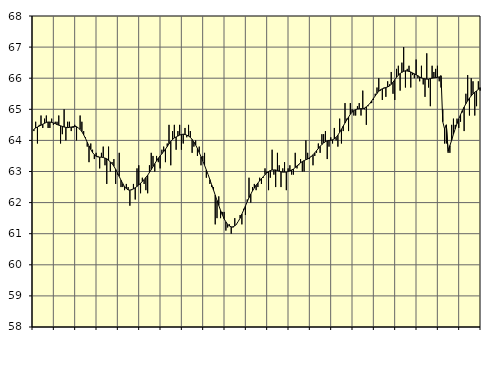
| Category | Piggar | Series 1 |
|---|---|---|
| nan | 64.3 | 64.36 |
| 1.0 | 64.6 | 64.4 |
| 1.0 | 63.9 | 64.43 |
| 1.0 | 64.5 | 64.46 |
| 1.0 | 64.8 | 64.49 |
| 1.0 | 64.4 | 64.52 |
| 1.0 | 64.7 | 64.55 |
| 1.0 | 64.8 | 64.58 |
| 1.0 | 64.4 | 64.59 |
| 1.0 | 64.4 | 64.59 |
| 1.0 | 64.7 | 64.58 |
| 1.0 | 64.5 | 64.56 |
| nan | 64.6 | 64.54 |
| 2.0 | 64.6 | 64.51 |
| 2.0 | 64.8 | 64.49 |
| 2.0 | 63.9 | 64.47 |
| 2.0 | 64.2 | 64.45 |
| 2.0 | 65 | 64.43 |
| 2.0 | 64 | 64.42 |
| 2.0 | 64.6 | 64.41 |
| 2.0 | 64.6 | 64.42 |
| 2.0 | 64.3 | 64.43 |
| 2.0 | 64.4 | 64.44 |
| 2.0 | 64.5 | 64.45 |
| nan | 64 | 64.44 |
| 3.0 | 64.4 | 64.4 |
| 3.0 | 64.8 | 64.35 |
| 3.0 | 64.6 | 64.28 |
| 3.0 | 64.3 | 64.18 |
| 3.0 | 64.1 | 64.07 |
| 3.0 | 63.8 | 63.94 |
| 3.0 | 63.3 | 63.82 |
| 3.0 | 63.9 | 63.71 |
| 3.0 | 63.7 | 63.61 |
| 3.0 | 63.4 | 63.54 |
| 3.0 | 63.6 | 63.49 |
| nan | 63.5 | 63.47 |
| 4.0 | 63.1 | 63.46 |
| 4.0 | 63.6 | 63.46 |
| 4.0 | 63.8 | 63.45 |
| 4.0 | 63.2 | 63.43 |
| 4.0 | 62.6 | 63.41 |
| 4.0 | 63.8 | 63.36 |
| 4.0 | 63 | 63.31 |
| 4.0 | 63.3 | 63.25 |
| 4.0 | 63.4 | 63.17 |
| 4.0 | 62.6 | 63.07 |
| 4.0 | 62.9 | 62.96 |
| nan | 63.6 | 62.84 |
| 5.0 | 62.5 | 62.72 |
| 5.0 | 62.5 | 62.61 |
| 5.0 | 62.4 | 62.51 |
| 5.0 | 62.6 | 62.45 |
| 5.0 | 62.5 | 62.41 |
| 5.0 | 61.9 | 62.4 |
| 5.0 | 62.4 | 62.42 |
| 5.0 | 62.6 | 62.44 |
| 5.0 | 62.1 | 62.48 |
| 5.0 | 63.1 | 62.52 |
| 5.0 | 63.2 | 62.57 |
| nan | 62.3 | 62.62 |
| 6.0 | 62.8 | 62.68 |
| 6.0 | 62.6 | 62.74 |
| 6.0 | 62.4 | 62.81 |
| 6.0 | 62.3 | 62.88 |
| 6.0 | 63.2 | 62.97 |
| 6.0 | 63.6 | 63.06 |
| 6.0 | 63.5 | 63.16 |
| 6.0 | 63 | 63.25 |
| 6.0 | 63.5 | 63.34 |
| 6.0 | 63.3 | 63.43 |
| 6.0 | 63.1 | 63.5 |
| nan | 63.7 | 63.57 |
| 7.0 | 63.8 | 63.64 |
| 7.0 | 63.3 | 63.72 |
| 7.0 | 63.9 | 63.8 |
| 7.0 | 64.5 | 63.89 |
| 7.0 | 63.2 | 63.97 |
| 7.0 | 64.3 | 64.03 |
| 7.0 | 64.5 | 64.08 |
| 7.0 | 63.7 | 64.11 |
| 7.0 | 64.3 | 64.14 |
| 7.0 | 64.5 | 64.17 |
| 7.0 | 63.7 | 64.19 |
| nan | 63.9 | 64.2 |
| 8.0 | 64.4 | 64.19 |
| 8.0 | 64.1 | 64.17 |
| 8.0 | 64.5 | 64.14 |
| 8.0 | 64.3 | 64.1 |
| 8.0 | 63.6 | 64.03 |
| 8.0 | 63.8 | 63.95 |
| 8.0 | 64 | 63.85 |
| 8.0 | 63.5 | 63.74 |
| 8.0 | 63.8 | 63.61 |
| 8.0 | 63.2 | 63.48 |
| 8.0 | 63.5 | 63.34 |
| nan | 63.6 | 63.2 |
| 9.0 | 62.8 | 63.05 |
| 9.0 | 62.9 | 62.9 |
| 9.0 | 62.6 | 62.74 |
| 9.0 | 62.5 | 62.57 |
| 9.0 | 62.5 | 62.41 |
| 9.0 | 61.3 | 62.24 |
| 9.0 | 61.5 | 62.07 |
| 9.0 | 62.2 | 61.91 |
| 9.0 | 61.5 | 61.75 |
| 9.0 | 61.7 | 61.61 |
| 9.0 | 61.7 | 61.48 |
| nan | 61.1 | 61.38 |
| 10.0 | 61.2 | 61.3 |
| 10.0 | 61.3 | 61.25 |
| 10.0 | 61 | 61.22 |
| 10.0 | 61.2 | 61.22 |
| 10.0 | 61.5 | 61.25 |
| 10.0 | 61.3 | 61.31 |
| 10.0 | 61.4 | 61.4 |
| 10.0 | 61.6 | 61.5 |
| 10.0 | 61.3 | 61.63 |
| 10.0 | 61.8 | 61.76 |
| 10.0 | 61.6 | 61.89 |
| nan | 62.1 | 62.03 |
| 11.0 | 62.8 | 62.16 |
| 11.0 | 62 | 62.27 |
| 11.0 | 62.5 | 62.38 |
| 11.0 | 62.6 | 62.47 |
| 11.0 | 62.4 | 62.56 |
| 11.0 | 62.5 | 62.63 |
| 11.0 | 62.8 | 62.7 |
| 11.0 | 62.6 | 62.77 |
| 11.0 | 62.8 | 62.83 |
| 11.0 | 63.1 | 62.9 |
| 11.0 | 63 | 62.95 |
| nan | 62.4 | 63 |
| 12.0 | 62.8 | 63.03 |
| 12.0 | 63.7 | 63.05 |
| 12.0 | 62.9 | 63.05 |
| 12.0 | 62.5 | 63.05 |
| 12.0 | 63.6 | 63.03 |
| 12.0 | 63.2 | 63.01 |
| 12.0 | 62.5 | 62.99 |
| 12.0 | 63.1 | 62.98 |
| 12.0 | 63.3 | 62.98 |
| 12.0 | 62.4 | 62.98 |
| 12.0 | 63.1 | 63 |
| nan | 63.2 | 63.02 |
| 13.0 | 62.9 | 63.05 |
| 13.0 | 62.9 | 63.08 |
| 13.0 | 63.6 | 63.13 |
| 13.0 | 63.1 | 63.18 |
| 13.0 | 63.2 | 63.23 |
| 13.0 | 63.4 | 63.28 |
| 13.0 | 63 | 63.32 |
| 13.0 | 63 | 63.35 |
| 13.0 | 64 | 63.38 |
| 13.0 | 63.6 | 63.4 |
| 13.0 | 63.4 | 63.44 |
| nan | 63.5 | 63.48 |
| 14.0 | 63.2 | 63.54 |
| 14.0 | 63.5 | 63.6 |
| 14.0 | 63.6 | 63.67 |
| 14.0 | 63.9 | 63.74 |
| 14.0 | 63.6 | 63.81 |
| 14.0 | 64.2 | 63.87 |
| 14.0 | 64.2 | 63.92 |
| 14.0 | 64.3 | 63.96 |
| 14.0 | 63.4 | 63.99 |
| 14.0 | 63.8 | 64 |
| 14.0 | 64.1 | 64 |
| nan | 63.9 | 64.02 |
| 15.0 | 64.4 | 64.05 |
| 15.0 | 64 | 64.1 |
| 15.0 | 63.8 | 64.17 |
| 15.0 | 64.7 | 64.26 |
| 15.0 | 63.9 | 64.36 |
| 15.0 | 64.3 | 64.46 |
| 15.0 | 65.2 | 64.56 |
| 15.0 | 64.7 | 64.66 |
| 15.0 | 64.3 | 64.75 |
| 15.0 | 65.2 | 64.84 |
| 15.0 | 65 | 64.91 |
| nan | 64.8 | 64.96 |
| 16.0 | 64.8 | 64.99 |
| 16.0 | 65.1 | 65.01 |
| 16.0 | 65.2 | 65.02 |
| 16.0 | 64.8 | 65.02 |
| 16.0 | 65.6 | 65.02 |
| 16.0 | 65 | 65.04 |
| 16.0 | 64.5 | 65.08 |
| 16.0 | 65.1 | 65.13 |
| 16.0 | 65.2 | 65.19 |
| 16.0 | 65.2 | 65.27 |
| 16.0 | 65.3 | 65.35 |
| nan | 65.5 | 65.43 |
| 17.0 | 65.7 | 65.51 |
| 17.0 | 66 | 65.58 |
| 17.0 | 65.6 | 65.63 |
| 17.0 | 65.3 | 65.66 |
| 17.0 | 65.7 | 65.68 |
| 17.0 | 65.4 | 65.7 |
| 17.0 | 65.9 | 65.72 |
| 17.0 | 65.8 | 65.75 |
| 17.0 | 66.2 | 65.8 |
| 17.0 | 65.5 | 65.87 |
| 17.0 | 65.3 | 65.95 |
| nan | 66.3 | 66.03 |
| 18.0 | 66.4 | 66.1 |
| 18.0 | 65.6 | 66.15 |
| 18.0 | 66.5 | 66.19 |
| 18.0 | 67 | 66.22 |
| 18.0 | 65.7 | 66.24 |
| 18.0 | 66.3 | 66.23 |
| 18.0 | 66.4 | 66.22 |
| 18.0 | 65.7 | 66.2 |
| 18.0 | 66.1 | 66.17 |
| 18.0 | 66 | 66.14 |
| 18.0 | 66.6 | 66.11 |
| nan | 66 | 66.08 |
| 19.0 | 65.9 | 66.04 |
| 19.0 | 66.4 | 66.01 |
| 19.0 | 65.8 | 65.99 |
| 19.0 | 65.4 | 65.98 |
| 19.0 | 66.8 | 65.97 |
| 19.0 | 65.7 | 65.97 |
| 19.0 | 65.1 | 65.99 |
| 19.0 | 66.4 | 66 |
| 19.0 | 66.2 | 66.01 |
| 19.0 | 66.3 | 66.02 |
| 19.0 | 66.4 | 66.03 |
| nan | 65.9 | 66.04 |
| 20.0 | 65.7 | 66.08 |
| 20.0 | 65 | 64.6 |
| 20.0 | 63.9 | 64.37 |
| 20.0 | 63.9 | 64.5 |
| 20.0 | 63.6 | 63.65 |
| 20.0 | 63.6 | 63.83 |
| 20.0 | 64.5 | 64.01 |
| 20.0 | 64.7 | 64.2 |
| 20.0 | 64.5 | 64.37 |
| 20.0 | 64.7 | 64.54 |
| 20.0 | 64.4 | 64.69 |
| nan | 64.6 | 64.83 |
| 21.0 | 64.9 | 64.96 |
| 21.0 | 64.3 | 65.07 |
| 21.0 | 65.5 | 65.18 |
| 21.0 | 66.1 | 65.27 |
| 21.0 | 64.8 | 65.36 |
| 21.0 | 66 | 65.43 |
| 21.0 | 65.9 | 65.5 |
| 21.0 | 64.8 | 65.55 |
| 21.0 | 65.1 | 65.59 |
| 21.0 | 65.9 | 65.64 |
| 21.0 | 65.6 | 65.7 |